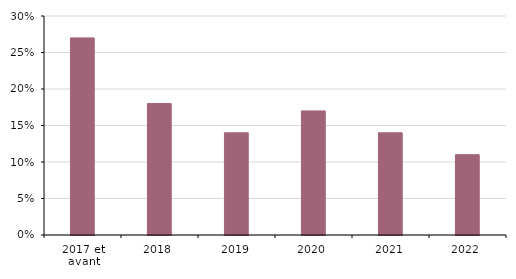
| Category | Series 0 |
|---|---|
| 2017 et avant | 0.27 |
| 2018 | 0.18 |
| 2019 | 0.14 |
| 2020 | 0.17 |
| 2021 | 0.14 |
| 2022 | 0.11 |